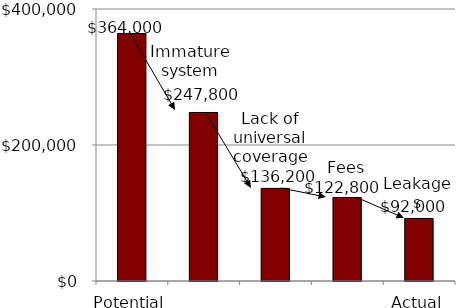
| Category | Series 0 |
|---|---|
| Potential | 364000 |
|  | 247800 |
|  | 136200 |
|  | 122800 |
| Actual | 92000 |